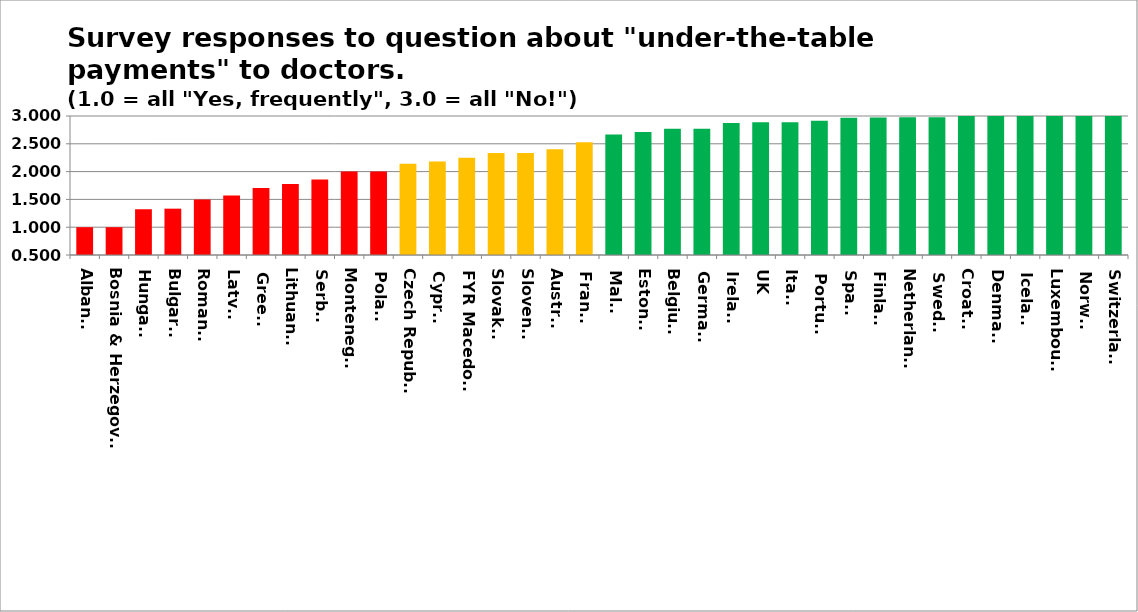
| Category | Series 0 |
|---|---|
| Albania | 1 |
| Bosnia & Herzegovina | 1 |
| Hungary | 1.323 |
| Bulgaria | 1.333 |
| Romania | 1.5 |
| Latvia | 1.571 |
| Greece | 1.706 |
| Lithuania | 1.778 |
| Serbia | 1.857 |
| Montenegro | 2 |
| Poland | 2 |
| Czech Republic | 2.143 |
| Cyprus | 2.182 |
| FYR Macedonia | 2.25 |
| Slovakia | 2.333 |
| Slovenia | 2.333 |
| Austria | 2.4 |
| France | 2.526 |
| Malta | 2.667 |
| Estonia | 2.714 |
| Belgium | 2.769 |
| Germany | 2.769 |
| Ireland | 2.875 |
| UK | 2.887 |
| Italy | 2.889 |
| Portugal | 2.917 |
| Spain | 2.967 |
| Finland | 2.973 |
| Netherlands | 2.976 |
| Sweden | 2.978 |
| Croatia | 3 |
| Denmark | 3 |
| Iceland | 3 |
| Luxembourg | 3 |
| Norway | 3 |
| Switzerland | 3 |